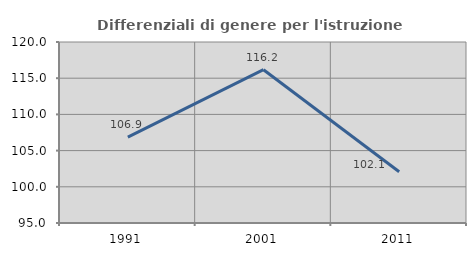
| Category | Differenziali di genere per l'istruzione superiore |
|---|---|
| 1991.0 | 106.865 |
| 2001.0 | 116.174 |
| 2011.0 | 102.072 |